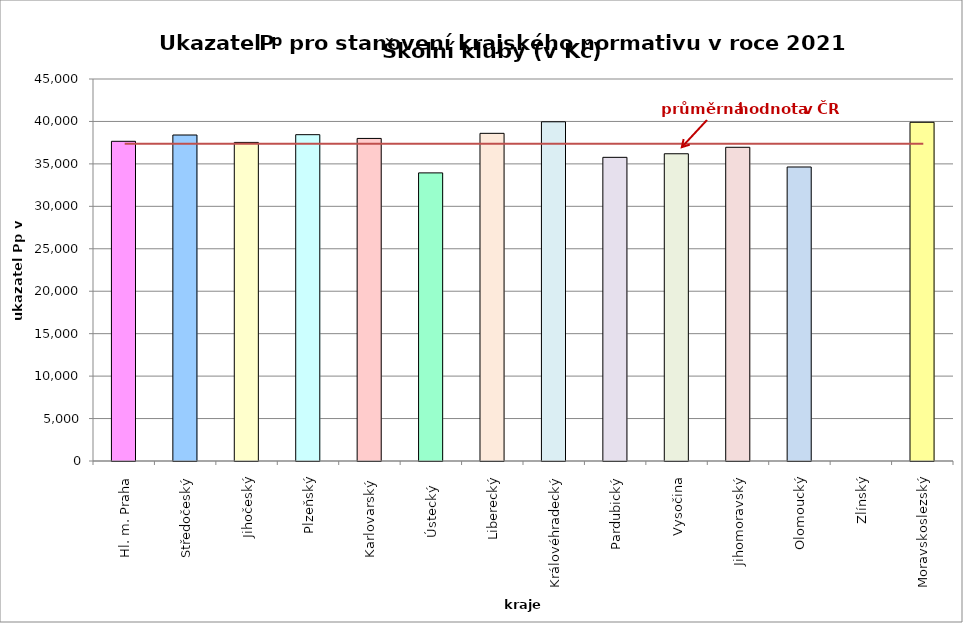
| Category | Series 0 |
|---|---|
| Hl. m. Praha | 37660 |
| Středočeský | 38403 |
| Jihočeský | 37529 |
| Plzeňský | 38441 |
| Karlovarský  | 38000 |
| Ústecký   | 33940 |
| Liberecký | 38600 |
| Královéhradecký | 39961 |
| Pardubický | 35772 |
| Vysočina | 36193 |
| Jihomoravský | 36956 |
| Olomoucký | 34635 |
| Zlínský | 0 |
| Moravskoslezský | 39900 |